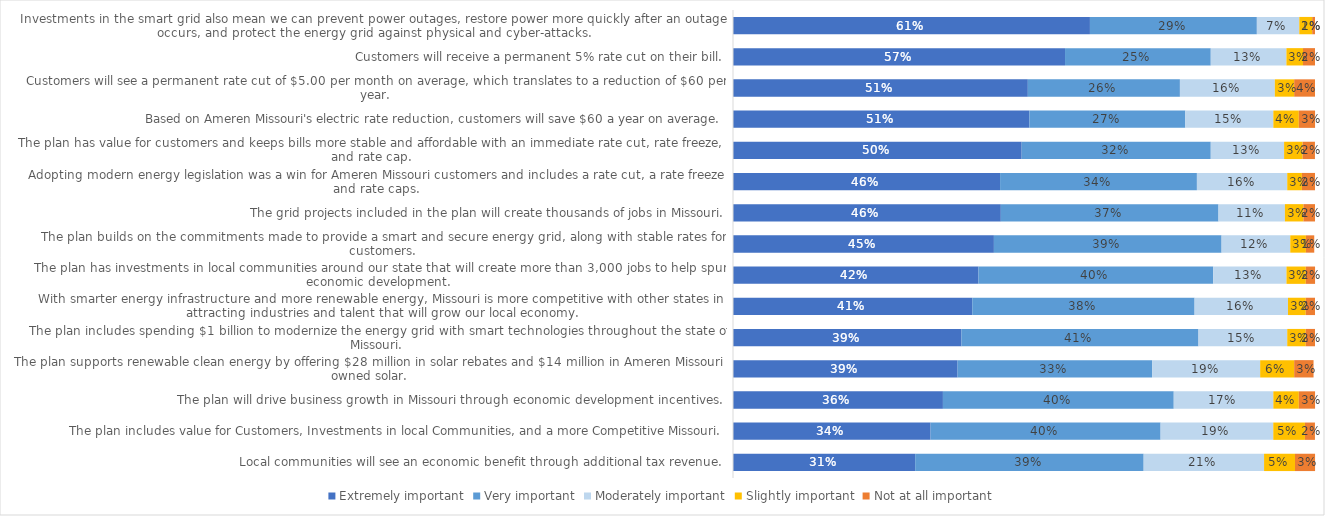
| Category | Extremely important | Very important | Moderately important | Slightly important | Not at all important |
|---|---|---|---|---|---|
| Local communities will see an economic benefit through additional tax revenue. | 0.313 | 0.393 | 0.207 | 0.053 | 0.034 |
| The plan includes value for Customers, Investments in local Communities, and a more Competitive Missouri. | 0.34 | 0.395 | 0.194 | 0.054 | 0.017 |
| The plan will drive business growth in Missouri through economic development incentives. | 0.361 | 0.397 | 0.171 | 0.044 | 0.028 |
| The plan supports renewable clean energy by offering $28 million in solar rebates and $14 million in Ameren Missouri owned solar. | 0.386 | 0.334 | 0.186 | 0.058 | 0.033 |
| The plan includes spending $1 billion to modernize the energy grid with smart technologies throughout the state of Missouri. | 0.393 | 0.407 | 0.152 | 0.032 | 0.016 |
| With smarter energy infrastructure and more renewable energy, Missouri is more competitive with other states in attracting industries and talent that will grow our local economy. | 0.411 | 0.382 | 0.16 | 0.03 | 0.016 |
| The plan has investments in local communities around our state that will create more than 3,000 jobs to help spur economic development. | 0.422 | 0.403 | 0.126 | 0.033 | 0.016 |
| The plan builds on the commitments made to provide a smart and secure energy grid, along with stable rates for customers. | 0.448 | 0.391 | 0.118 | 0.027 | 0.014 |
| The grid projects included in the plan will create thousands of jobs in Missouri. | 0.46 | 0.374 | 0.114 | 0.032 | 0.02 |
| Adopting modern energy legislation was a win for Ameren Missouri customers and includes a rate cut, a rate freeze and rate caps. | 0.459 | 0.338 | 0.155 | 0.025 | 0.022 |
| The plan has value for customers and keeps bills more stable and affordable with an immediate rate cut, rate freeze, and rate cap. | 0.496 | 0.325 | 0.126 | 0.032 | 0.021 |
| Based on Ameren Missouri's electric rate reduction, customers will save $60 a year on average. | 0.509 | 0.268 | 0.151 | 0.044 | 0.028 |
| Customers will see a permanent rate cut of $5.00 per month on average, which translates to a reduction of $60 per year. | 0.507 | 0.261 | 0.163 | 0.033 | 0.036 |
| Customers will receive a permanent 5% rate cut on their bill. | 0.57 | 0.25 | 0.13 | 0.028 | 0.021 |
| Investments in the smart grid also mean we can prevent power outages, restore power more quickly after an outage occurs, and protect the energy grid against physical and cyber-attacks. | 0.613 | 0.287 | 0.073 | 0.022 | 0.01 |